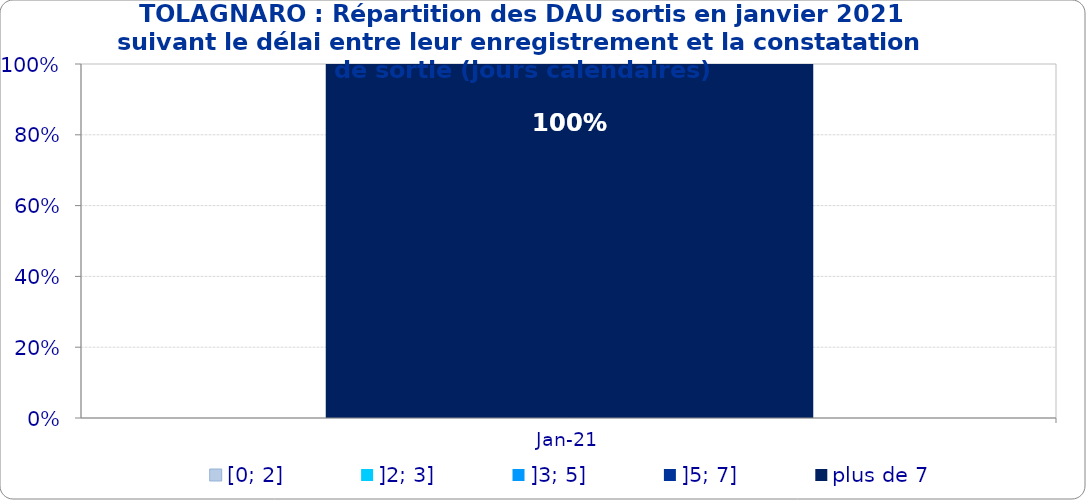
| Category | [0; 2] | ]2; 3] | ]3; 5] | ]5; 7] | plus de 7 |
|---|---|---|---|---|---|
| 2021-01-01 | 0 | 0 | 0 | 0 | 1 |